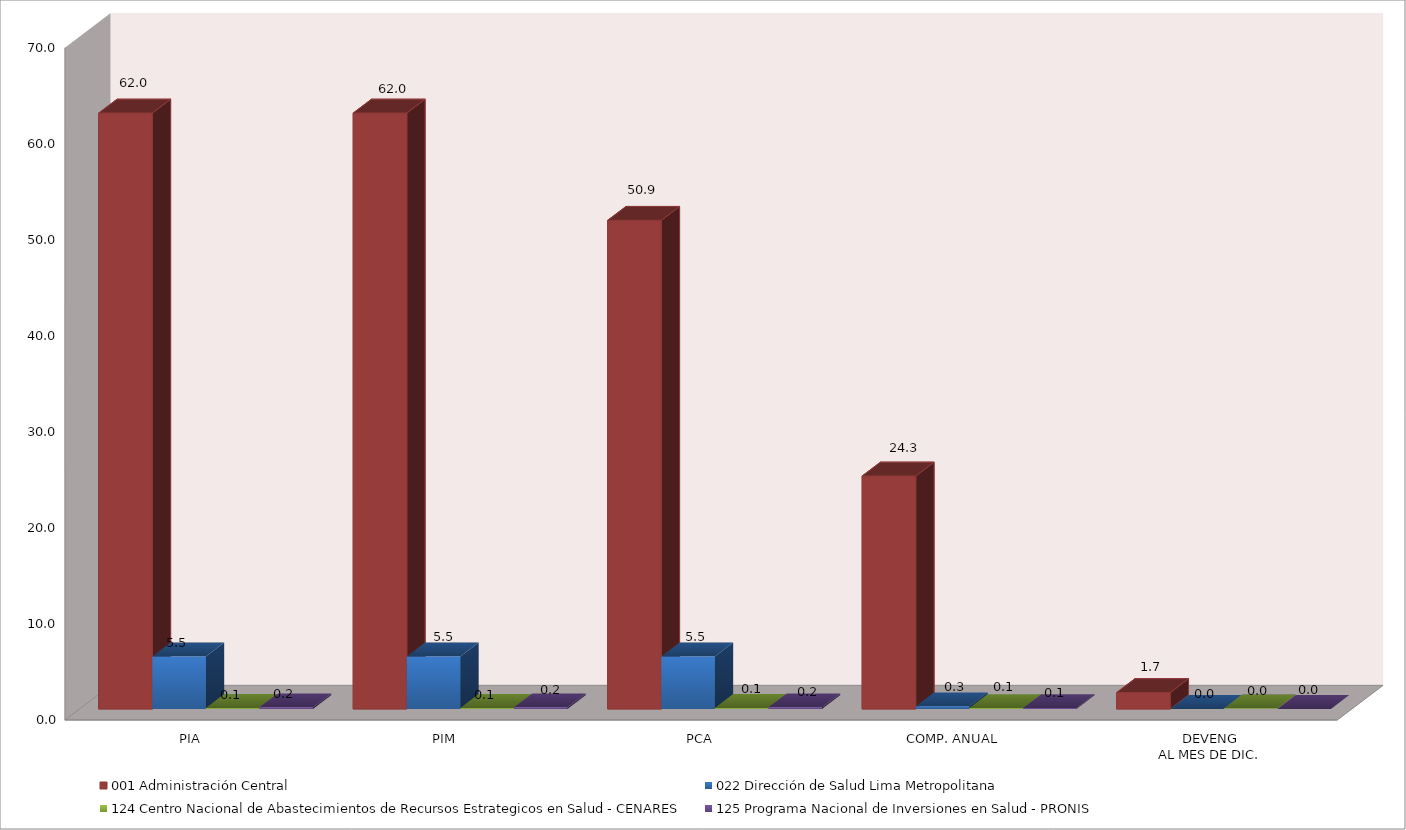
| Category | 001 Administración Central | 022 Dirección de Salud Lima Metropolitana | 124 Centro Nacional de Abastecimientos de Recursos Estrategicos en Salud - CENARES | 125 Programa Nacional de Inversiones en Salud - PRONIS |
|---|---|---|---|---|
| PIA | 62.041 | 5.464 | 0.1 | 0.163 |
| PIM | 62.041 | 5.464 | 0.1 | 0.163 |
| PCA | 50.873 | 5.464 | 0.1 | 0.163 |
| COMP. ANUAL | 24.252 | 0.278 | 0.087 | 0.092 |
| DEVENG
AL MES DE DIC. | 1.708 | 0.005 | 0.047 | 0 |